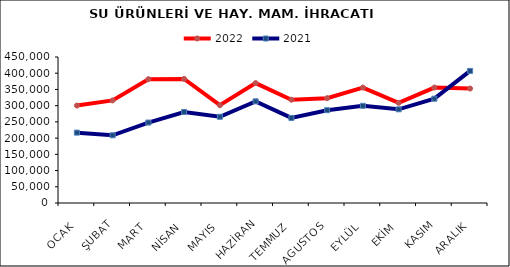
| Category | 2022 | 2021 |
|---|---|---|
| OCAK | 300295.32 | 216886.9 |
| ŞUBAT | 316201.99 | 208723.363 |
| MART | 381564.509 | 247977.977 |
| NİSAN | 382464.252 | 280588.888 |
| MAYIS | 301401.85 | 265663.39 |
| HAZİRAN | 369561.763 | 313347.256 |
| TEMMUZ | 318336.141 | 262176.965 |
| AGUSTOS | 323036.572 | 286061.997 |
| EYLÜL | 355787.517 | 299483.459 |
| EKİM | 308796.146 | 288750.815 |
| KASIM | 355827.066 | 321478.482 |
| ARALIK | 352772.73 | 407113.888 |